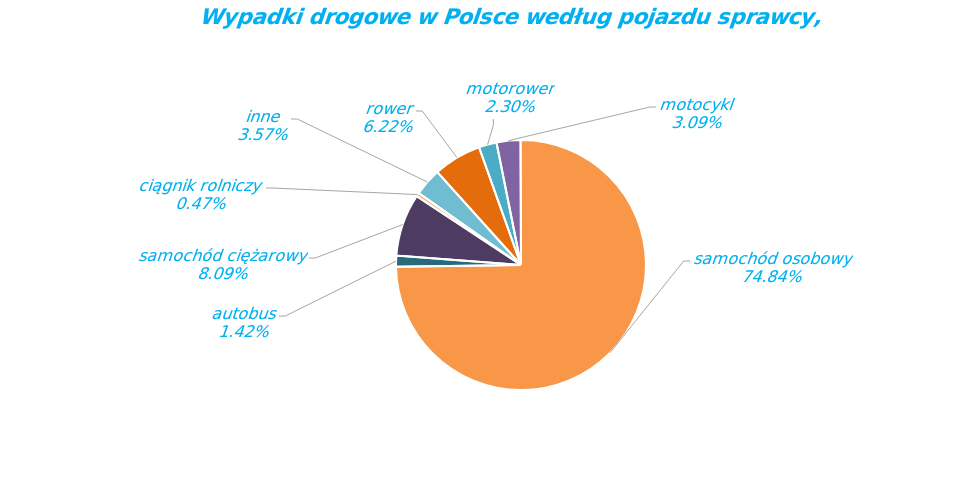
| Category | Series 0 |
|---|---|
| rower | 1713 |
| motorower | 635 |
| motocykl | 852 |
| samochód osobowy | 20622 |
| autobus | 391 |
| samochód ciężarowy | 2228 |
| ciągnik rolniczy | 130 |
| inne | 985 |